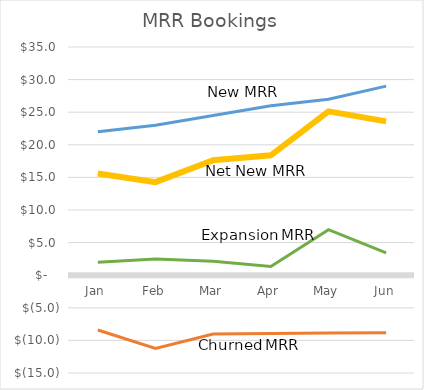
| Category | New MRR | Churned MRR | Expansion MRR | Net New MRR |
|---|---|---|---|---|
| Jan | 22 | -8.4 | 2 | 15.6 |
| Feb | 23 | -11.221 | 2.494 | 14.272 |
| Mar | 24.5 | -9.027 | 2.149 | 17.622 |
| Apr | 26 | -8.95 | 1.342 | 18.393 |
| May | 27 | -8.852 | 6.988 | 25.136 |
| Jun | 29 | -8.838 | 3.437 | 23.599 |